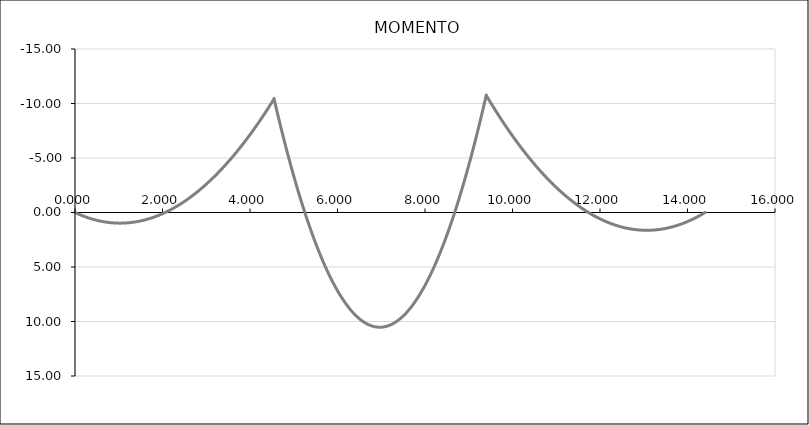
| Category | Series 1 |
|---|---|
| 0.0 | 0 |
| 0.0 | 0 |
| 0.0 | 0 |
| 0.0 | 0 |
| 0.0 | 0 |
| 0.0 | 0 |
| 0.0 | 0 |
| 0.0 | 0 |
| 0.0 | 0 |
| 0.0 | 0 |
| 0.0 | 0 |
| 0.0 | 0 |
| 0.0 | 0 |
| 0.0 | 0 |
| 0.0 | 0 |
| 0.0 | 0 |
| 0.0 | 0 |
| 0.0 | 0 |
| 0.0 | 0 |
| 0.0 | 0 |
| 0.0 | 0 |
| 0.0 | 0 |
| 0.0 | 0 |
| 0.0 | 0 |
| 0.0 | 0 |
| 0.0 | 0 |
| 0.0 | 0 |
| 0.0 | 0 |
| 0.0 | 0 |
| 0.0 | 0 |
| 0.0 | 0 |
| 0.0 | 0 |
| 0.0 | 0 |
| 0.0 | 0 |
| 0.0 | 0 |
| 0.0 | 0 |
| 0.0 | 0 |
| 0.0 | 0 |
| 0.0 | 0 |
| 0.0 | 0 |
| 0.0 | 0 |
| 0.0 | 0 |
| 0.0 | 0 |
| 0.0 | 0 |
| 0.0 | 0 |
| 0.0 | 0 |
| 0.0 | 0 |
| 0.0 | 0 |
| 0.0 | 0 |
| 0.0 | 0 |
| 0.0 | 0 |
| 0.0 | 0 |
| 0.0 | 0 |
| 0.0 | 0 |
| 0.0 | 0 |
| 0.0 | 0 |
| 0.0 | 0 |
| 0.0 | 0 |
| 0.0 | 0 |
| 0.0 | 0 |
| 0.0 | 0 |
| 0.0 | 0 |
| 0.0 | 0 |
| 0.0 | 0 |
| 0.0 | 0 |
| 0.0 | 0 |
| 0.0 | 0 |
| 0.0 | 0 |
| 0.0 | 0 |
| 0.0 | 0 |
| 0.0 | 0 |
| 0.0 | 0 |
| 0.0 | 0 |
| 0.0 | 0 |
| 0.0 | 0 |
| 0.0 | 0 |
| 0.0 | 0 |
| 0.0 | 0 |
| 0.0 | 0 |
| 0.0 | 0 |
| 0.0 | 0 |
| 0.0 | 0 |
| 0.0 | 0 |
| 0.0 | 0 |
| 0.0 | 0 |
| 0.0 | 0 |
| 0.0 | 0 |
| 0.0 | 0 |
| 0.0 | 0 |
| 0.0 | 0 |
| 0.0 | 0 |
| 0.0 | 0 |
| 0.0 | 0 |
| 0.0 | 0 |
| 0.0 | 0 |
| 0.0 | 0 |
| 0.0 | 0 |
| 0.0 | 0 |
| 0.0 | 0 |
| 0.0 | 0 |
| 0.0 | 0 |
| 0.0 | 0 |
| 0.02275 | 0.043 |
| 0.0455 | 0.084 |
| 0.06825 | 0.125 |
| 0.091 | 0.165 |
| 0.11374999999999999 | 0.204 |
| 0.1365 | 0.242 |
| 0.15925 | 0.278 |
| 0.182 | 0.314 |
| 0.20475 | 0.349 |
| 0.22749999999999998 | 0.383 |
| 0.25025 | 0.417 |
| 0.273 | 0.449 |
| 0.29575 | 0.48 |
| 0.3185 | 0.51 |
| 0.34125 | 0.539 |
| 0.364 | 0.568 |
| 0.38675 | 0.595 |
| 0.4095 | 0.622 |
| 0.43224999999999997 | 0.647 |
| 0.45499999999999996 | 0.672 |
| 0.47775 | 0.695 |
| 0.5005 | 0.718 |
| 0.52325 | 0.74 |
| 0.546 | 0.76 |
| 0.56875 | 0.78 |
| 0.5915 | 0.799 |
| 0.61425 | 0.817 |
| 0.637 | 0.834 |
| 0.65975 | 0.85 |
| 0.6825 | 0.865 |
| 0.7052499999999999 | 0.879 |
| 0.728 | 0.892 |
| 0.75075 | 0.904 |
| 0.7735 | 0.915 |
| 0.79625 | 0.925 |
| 0.819 | 0.935 |
| 0.84175 | 0.943 |
| 0.8644999999999999 | 0.951 |
| 0.88725 | 0.957 |
| 0.9099999999999999 | 0.962 |
| 0.93275 | 0.967 |
| 0.9555 | 0.971 |
| 0.97825 | 0.973 |
| 1.001 | 0.975 |
| 1.02375 | 0.976 |
| 1.0465 | 0.975 |
| 1.06925 | 0.974 |
| 1.092 | 0.972 |
| 1.11475 | 0.969 |
| 1.1375 | 0.965 |
| 1.16025 | 0.96 |
| 1.183 | 0.954 |
| 1.2057499999999999 | 0.947 |
| 1.2285 | 0.939 |
| 1.25125 | 0.931 |
| 1.274 | 0.921 |
| 1.29675 | 0.91 |
| 1.3195 | 0.898 |
| 1.34225 | 0.886 |
| 1.365 | 0.872 |
| 1.38775 | 0.858 |
| 1.4104999999999999 | 0.842 |
| 1.43325 | 0.826 |
| 1.456 | 0.809 |
| 1.47875 | 0.79 |
| 1.5015 | 0.771 |
| 1.5242499999999999 | 0.751 |
| 1.547 | 0.73 |
| 1.56975 | 0.707 |
| 1.5925 | 0.684 |
| 1.6152499999999999 | 0.66 |
| 1.638 | 0.635 |
| 1.66075 | 0.609 |
| 1.6835 | 0.582 |
| 1.70625 | 0.555 |
| 1.7289999999999999 | 0.526 |
| 1.75175 | 0.496 |
| 1.7745 | 0.465 |
| 1.79725 | 0.434 |
| 1.8199999999999998 | 0.401 |
| 1.8427499999999999 | 0.368 |
| 1.8655 | 0.333 |
| 1.88825 | 0.298 |
| 1.911 | 0.261 |
| 1.9337499999999999 | 0.224 |
| 1.9565 | 0.186 |
| 1.97925 | 0.146 |
| 2.002 | 0.106 |
| 2.02475 | 0.065 |
| 2.0475 | 0.023 |
| 2.07025 | -0.02 |
| 2.093 | -0.064 |
| 2.11575 | -0.109 |
| 2.1385 | -0.155 |
| 2.16125 | -0.202 |
| 2.184 | -0.25 |
| 2.20675 | -0.299 |
| 2.2295 | -0.349 |
| 2.25225 | -0.399 |
| 2.275 | -0.451 |
| 2.2977499999999997 | -0.503 |
| 2.3205 | -0.557 |
| 2.34325 | -0.612 |
| 2.366 | -0.667 |
| 2.38875 | -0.723 |
| 2.4114999999999998 | -0.781 |
| 2.43425 | -0.839 |
| 2.457 | -0.898 |
| 2.47975 | -0.959 |
| 2.5025 | -1.02 |
| 2.5252499999999998 | -1.082 |
| 2.548 | -1.145 |
| 2.57075 | -1.209 |
| 2.5935 | -1.274 |
| 2.61625 | -1.34 |
| 2.639 | -1.407 |
| 2.66175 | -1.475 |
| 2.6845 | -1.543 |
| 2.7072499999999997 | -1.613 |
| 2.73 | -1.684 |
| 2.75275 | -1.755 |
| 2.7755 | -1.828 |
| 2.79825 | -1.902 |
| 2.8209999999999997 | -1.976 |
| 2.84375 | -2.052 |
| 2.8665 | -2.128 |
| 2.88925 | -2.205 |
| 2.912 | -2.284 |
| 2.9347499999999997 | -2.363 |
| 2.9575 | -2.443 |
| 2.98025 | -2.524 |
| 3.003 | -2.606 |
| 3.02575 | -2.689 |
| 3.0484999999999998 | -2.774 |
| 3.07125 | -2.858 |
| 3.094 | -2.944 |
| 3.11675 | -3.031 |
| 3.1395 | -3.119 |
| 3.16225 | -3.208 |
| 3.185 | -3.298 |
| 3.20775 | -3.388 |
| 3.2304999999999997 | -3.48 |
| 3.25325 | -3.573 |
| 3.276 | -3.666 |
| 3.29875 | -3.761 |
| 3.3215 | -3.856 |
| 3.3442499999999997 | -3.953 |
| 3.367 | -4.05 |
| 3.38975 | -4.148 |
| 3.4125 | -4.247 |
| 3.43525 | -4.348 |
| 3.4579999999999997 | -4.449 |
| 3.48075 | -4.551 |
| 3.5035 | -4.654 |
| 3.52625 | -4.758 |
| 3.549 | -4.863 |
| 3.5717499999999998 | -4.969 |
| 3.5945 | -5.076 |
| 3.61725 | -5.184 |
| 3.6399999999999997 | -5.292 |
| 3.66275 | -5.402 |
| 3.6854999999999998 | -5.513 |
| 3.70825 | -5.625 |
| 3.731 | -5.737 |
| 3.7537499999999997 | -5.851 |
| 3.7765 | -5.965 |
| 3.79925 | -6.081 |
| 3.822 | -6.197 |
| 3.84475 | -6.314 |
| 3.8674999999999997 | -6.433 |
| 3.89025 | -6.552 |
| 3.913 | -6.672 |
| 3.93575 | -6.793 |
| 3.9585 | -6.915 |
| 3.9812499999999997 | -7.039 |
| 4.004 | -7.163 |
| 4.02675 | -7.288 |
| 4.0495 | -7.413 |
| 4.0722499999999995 | -7.54 |
| 4.095 | -7.668 |
| 4.11775 | -7.797 |
| 4.1405 | -7.927 |
| 4.16325 | -8.057 |
| 4.186 | -8.189 |
| 4.20875 | -8.322 |
| 4.2315 | -8.455 |
| 4.25425 | -8.59 |
| 4.277 | -8.725 |
| 4.2997499999999995 | -8.862 |
| 4.3225 | -8.999 |
| 4.34525 | -9.137 |
| 4.368 | -9.276 |
| 4.39075 | -9.417 |
| 4.4135 | -9.558 |
| 4.43625 | -9.7 |
| 4.459 | -9.843 |
| 4.48175 | -9.987 |
| 4.5045 | -10.132 |
| 4.5272499999999996 | -10.278 |
| 4.55 | -10.425 |
| 4.55 | -10.425 |
| 4.57425 | -10.006 |
| 4.5985 | -9.592 |
| 4.62275 | -9.182 |
| 4.647 | -8.776 |
| 4.67125 | -8.375 |
| 4.6955 | -7.977 |
| 4.7197499999999994 | -7.584 |
| 4.744 | -7.195 |
| 4.76825 | -6.81 |
| 4.7924999999999995 | -6.43 |
| 4.81675 | -6.054 |
| 4.841 | -5.681 |
| 4.86525 | -5.314 |
| 4.8895 | -4.95 |
| 4.913749999999999 | -4.591 |
| 4.938 | -4.235 |
| 4.96225 | -3.884 |
| 4.9864999999999995 | -3.538 |
| 5.01075 | -3.195 |
| 5.035 | -2.857 |
| 5.05925 | -2.523 |
| 5.0835 | -2.193 |
| 5.107749999999999 | -1.867 |
| 5.132 | -1.546 |
| 5.15625 | -1.229 |
| 5.180499999999999 | -0.916 |
| 5.20475 | -0.607 |
| 5.229 | -0.303 |
| 5.2532499999999995 | -0.002 |
| 5.2775 | 0.294 |
| 5.30175 | 0.585 |
| 5.326 | 0.873 |
| 5.35025 | 1.156 |
| 5.374499999999999 | 1.436 |
| 5.39875 | 1.711 |
| 5.423 | 1.981 |
| 5.4472499999999995 | 2.248 |
| 5.4715 | 2.51 |
| 5.495749999999999 | 2.768 |
| 5.52 | 3.022 |
| 5.54425 | 3.272 |
| 5.5685 | 3.517 |
| 5.59275 | 3.758 |
| 5.617 | 3.995 |
| 5.641249999999999 | 4.228 |
| 5.6655 | 4.456 |
| 5.68975 | 4.681 |
| 5.7139999999999995 | 4.901 |
| 5.73825 | 5.117 |
| 5.762499999999999 | 5.328 |
| 5.78675 | 5.536 |
| 5.811 | 5.739 |
| 5.835249999999999 | 5.938 |
| 5.8595 | 6.132 |
| 5.883749999999999 | 6.323 |
| 5.9079999999999995 | 6.509 |
| 5.93225 | 6.691 |
| 5.9565 | 6.869 |
| 5.98075 | 7.043 |
| 6.005 | 7.212 |
| 6.029249999999999 | 7.377 |
| 6.0535 | 7.538 |
| 6.07775 | 7.695 |
| 6.101999999999999 | 7.847 |
| 6.12625 | 7.996 |
| 6.150499999999999 | 8.14 |
| 6.1747499999999995 | 8.28 |
| 6.199 | 8.415 |
| 6.22325 | 8.547 |
| 6.2475 | 8.674 |
| 6.27175 | 8.797 |
| 6.295999999999999 | 8.915 |
| 6.32025 | 9.03 |
| 6.3445 | 9.14 |
| 6.3687499999999995 | 9.246 |
| 6.393 | 9.348 |
| 6.417249999999999 | 9.446 |
| 6.4415 | 9.539 |
| 6.46575 | 9.628 |
| 6.489999999999999 | 9.713 |
| 6.51425 | 9.794 |
| 6.538499999999999 | 9.87 |
| 6.562749999999999 | 9.943 |
| 6.587 | 10.011 |
| 6.61125 | 10.075 |
| 6.6354999999999995 | 10.134 |
| 6.659749999999999 | 10.19 |
| 6.683999999999999 | 10.241 |
| 6.70825 | 10.288 |
| 6.7325 | 10.33 |
| 6.756749999999999 | 10.369 |
| 6.781 | 10.403 |
| 6.805249999999999 | 10.433 |
| 6.8294999999999995 | 10.459 |
| 6.85375 | 10.481 |
| 6.878 | 10.498 |
| 6.9022499999999996 | 10.511 |
| 6.926499999999999 | 10.52 |
| 6.950749999999999 | 10.525 |
| 6.975 | 10.525 |
| 6.99925 | 10.522 |
| 7.023499999999999 | 10.514 |
| 7.04775 | 10.502 |
| 7.071999999999999 | 10.485 |
| 7.0962499999999995 | 10.465 |
| 7.1205 | 10.44 |
| 7.14475 | 10.411 |
| 7.169 | 10.377 |
| 7.193249999999999 | 10.34 |
| 7.217499999999999 | 10.298 |
| 7.24175 | 10.252 |
| 7.266 | 10.202 |
| 7.2902499999999995 | 10.148 |
| 7.314499999999999 | 10.089 |
| 7.338749999999999 | 10.026 |
| 7.3629999999999995 | 9.959 |
| 7.38725 | 9.888 |
| 7.411499999999999 | 9.812 |
| 7.43575 | 9.733 |
| 7.459999999999999 | 9.649 |
| 7.484249999999999 | 9.561 |
| 7.5085 | 9.468 |
| 7.53275 | 9.372 |
| 7.5569999999999995 | 9.271 |
| 7.581249999999999 | 9.166 |
| 7.605499999999999 | 9.056 |
| 7.62975 | 8.943 |
| 7.654 | 8.825 |
| 7.678249999999999 | 8.703 |
| 7.7025 | 8.577 |
| 7.726749999999999 | 8.447 |
| 7.7509999999999994 | 8.312 |
| 7.77525 | 8.173 |
| 7.7995 | 8.03 |
| 7.8237499999999995 | 7.883 |
| 7.847999999999999 | 7.731 |
| 7.872249999999999 | 7.576 |
| 7.8965 | 7.416 |
| 7.92075 | 7.251 |
| 7.944999999999999 | 7.083 |
| 7.969249999999999 | 6.91 |
| 7.993499999999999 | 6.734 |
| 8.01775 | 6.553 |
| 8.042 | 6.367 |
| 8.06625 | 6.178 |
| 8.090499999999999 | 5.984 |
| 8.114749999999999 | 5.786 |
| 8.139 | 5.584 |
| 8.16325 | 5.378 |
| 8.1875 | 5.167 |
| 8.211749999999999 | 4.952 |
| 8.235999999999999 | 4.733 |
| 8.26025 | 4.51 |
| 8.2845 | 4.282 |
| 8.30875 | 4.051 |
| 8.332999999999998 | 3.815 |
| 8.357249999999999 | 3.574 |
| 8.381499999999999 | 3.33 |
| 8.40575 | 3.081 |
| 8.43 | 2.829 |
| 8.45425 | 2.572 |
| 8.4785 | 2.31 |
| 8.502749999999999 | 2.045 |
| 8.527 | 1.775 |
| 8.55125 | 1.501 |
| 8.575499999999998 | 1.223 |
| 8.59975 | 0.94 |
| 8.623999999999999 | 0.654 |
| 8.648249999999999 | 0.363 |
| 8.6725 | 0.068 |
| 8.69675 | -0.231 |
| 8.721 | -0.535 |
| 8.745249999999999 | -0.843 |
| 8.769499999999999 | -1.155 |
| 8.79375 | -1.471 |
| 8.818 | -1.791 |
| 8.84225 | -2.116 |
| 8.866499999999998 | -2.445 |
| 8.89075 | -2.778 |
| 8.915 | -3.115 |
| 8.93925 | -3.456 |
| 8.9635 | -3.802 |
| 8.987749999999998 | -4.152 |
| 9.012 | -4.506 |
| 9.036249999999999 | -4.865 |
| 9.0605 | -5.227 |
| 9.08475 | -5.594 |
| 9.108999999999998 | -5.965 |
| 9.13325 | -6.34 |
| 9.157499999999999 | -6.72 |
| 9.18175 | -7.104 |
| 9.206 | -7.492 |
| 9.230249999999998 | -7.884 |
| 9.2545 | -8.28 |
| 9.278749999999999 | -8.681 |
| 9.302999999999999 | -9.086 |
| 9.32725 | -9.495 |
| 9.3515 | -9.908 |
| 9.37575 | -10.326 |
| 9.399999999999999 | -10.747 |
| 9.399999999999999 | -10.747 |
| 9.424999999999999 | -10.579 |
| 9.45 | -10.412 |
| 9.474999999999998 | -10.246 |
| 9.499999999999998 | -10.081 |
| 9.524999999999999 | -9.918 |
| 9.549999999999999 | -9.756 |
| 9.575 | -9.594 |
| 9.599999999999998 | -9.434 |
| 9.624999999999998 | -9.275 |
| 9.649999999999999 | -9.117 |
| 9.674999999999999 | -8.961 |
| 9.7 | -8.805 |
| 9.724999999999998 | -8.651 |
| 9.749999999999998 | -8.498 |
| 9.774999999999999 | -8.346 |
| 9.799999999999999 | -8.195 |
| 9.825 | -8.045 |
| 9.849999999999998 | -7.896 |
| 9.874999999999998 | -7.749 |
| 9.899999999999999 | -7.603 |
| 9.924999999999999 | -7.457 |
| 9.95 | -7.313 |
| 9.974999999999998 | -7.17 |
| 9.999999999999998 | -7.029 |
| 10.024999999999999 | -6.888 |
| 10.049999999999999 | -6.749 |
| 10.075 | -6.611 |
| 10.099999999999998 | -6.473 |
| 10.124999999999998 | -6.337 |
| 10.149999999999999 | -6.203 |
| 10.174999999999999 | -6.069 |
| 10.2 | -5.936 |
| 10.224999999999998 | -5.805 |
| 10.249999999999998 | -5.675 |
| 10.274999999999999 | -5.546 |
| 10.299999999999999 | -5.418 |
| 10.325 | -5.291 |
| 10.349999999999998 | -5.166 |
| 10.374999999999998 | -5.041 |
| 10.399999999999999 | -4.918 |
| 10.424999999999999 | -4.796 |
| 10.45 | -4.675 |
| 10.474999999999998 | -4.555 |
| 10.499999999999998 | -4.436 |
| 10.524999999999999 | -4.318 |
| 10.549999999999999 | -4.202 |
| 10.575 | -4.087 |
| 10.599999999999998 | -3.973 |
| 10.624999999999998 | -3.86 |
| 10.649999999999999 | -3.748 |
| 10.674999999999999 | -3.637 |
| 10.7 | -3.528 |
| 10.724999999999998 | -3.419 |
| 10.749999999999998 | -3.312 |
| 10.774999999999999 | -3.206 |
| 10.799999999999999 | -3.101 |
| 10.825 | -2.997 |
| 10.849999999999998 | -2.895 |
| 10.874999999999998 | -2.793 |
| 10.899999999999999 | -2.693 |
| 10.924999999999999 | -2.594 |
| 10.95 | -2.496 |
| 10.974999999999998 | -2.399 |
| 10.999999999999998 | -2.303 |
| 11.024999999999999 | -2.209 |
| 11.049999999999999 | -2.115 |
| 11.075 | -2.023 |
| 11.099999999999998 | -1.932 |
| 11.124999999999998 | -1.842 |
| 11.149999999999999 | -1.753 |
| 11.174999999999999 | -1.666 |
| 11.2 | -1.579 |
| 11.224999999999998 | -1.494 |
| 11.249999999999998 | -1.409 |
| 11.274999999999999 | -1.326 |
| 11.299999999999999 | -1.244 |
| 11.325 | -1.164 |
| 11.349999999999998 | -1.084 |
| 11.374999999999998 | -1.006 |
| 11.399999999999999 | -0.928 |
| 11.424999999999999 | -0.852 |
| 11.45 | -0.777 |
| 11.474999999999998 | -0.703 |
| 11.499999999999998 | -0.631 |
| 11.524999999999999 | -0.559 |
| 11.549999999999999 | -0.489 |
| 11.575 | -0.419 |
| 11.599999999999998 | -0.351 |
| 11.624999999999998 | -0.284 |
| 11.649999999999999 | -0.218 |
| 11.674999999999999 | -0.154 |
| 11.7 | -0.09 |
| 11.724999999999998 | -0.028 |
| 11.749999999999998 | 0.033 |
| 11.774999999999999 | 0.093 |
| 11.799999999999999 | 0.152 |
| 11.825 | 0.21 |
| 11.849999999999998 | 0.267 |
| 11.874999999999998 | 0.322 |
| 11.899999999999999 | 0.376 |
| 11.924999999999999 | 0.43 |
| 11.95 | 0.482 |
| 11.974999999999998 | 0.532 |
| 11.999999999999998 | 0.582 |
| 12.024999999999999 | 0.631 |
| 12.049999999999999 | 0.678 |
| 12.075 | 0.724 |
| 12.099999999999998 | 0.769 |
| 12.124999999999998 | 0.813 |
| 12.149999999999999 | 0.856 |
| 12.174999999999999 | 0.898 |
| 12.2 | 0.938 |
| 12.224999999999998 | 0.978 |
| 12.249999999999998 | 1.016 |
| 12.274999999999999 | 1.053 |
| 12.299999999999999 | 1.089 |
| 12.325 | 1.124 |
| 12.349999999999998 | 1.157 |
| 12.374999999999998 | 1.19 |
| 12.399999999999999 | 1.221 |
| 12.424999999999999 | 1.251 |
| 12.45 | 1.28 |
| 12.474999999999998 | 1.308 |
| 12.499999999999998 | 1.335 |
| 12.524999999999999 | 1.36 |
| 12.549999999999999 | 1.385 |
| 12.575 | 1.408 |
| 12.599999999999998 | 1.43 |
| 12.624999999999998 | 1.451 |
| 12.649999999999999 | 1.471 |
| 12.674999999999999 | 1.49 |
| 12.7 | 1.507 |
| 12.724999999999998 | 1.524 |
| 12.749999999999998 | 1.539 |
| 12.774999999999999 | 1.553 |
| 12.799999999999999 | 1.566 |
| 12.825 | 1.577 |
| 12.849999999999998 | 1.588 |
| 12.874999999999998 | 1.598 |
| 12.899999999999999 | 1.606 |
| 12.924999999999999 | 1.613 |
| 12.95 | 1.619 |
| 12.974999999999998 | 1.624 |
| 12.999999999999998 | 1.628 |
| 13.024999999999999 | 1.63 |
| 13.049999999999999 | 1.632 |
| 13.075 | 1.632 |
| 13.099999999999998 | 1.631 |
| 13.124999999999998 | 1.629 |
| 13.149999999999999 | 1.626 |
| 13.174999999999999 | 1.621 |
| 13.2 | 1.616 |
| 13.224999999999998 | 1.609 |
| 13.249999999999998 | 1.601 |
| 13.274999999999999 | 1.592 |
| 13.299999999999999 | 1.582 |
| 13.325 | 1.571 |
| 13.349999999999998 | 1.559 |
| 13.374999999999998 | 1.545 |
| 13.399999999999999 | 1.531 |
| 13.424999999999999 | 1.515 |
| 13.45 | 1.498 |
| 13.474999999999998 | 1.48 |
| 13.5 | 1.46 |
| 13.524999999999999 | 1.44 |
| 13.549999999999999 | 1.418 |
| 13.575 | 1.396 |
| 13.599999999999998 | 1.372 |
| 13.625 | 1.347 |
| 13.649999999999999 | 1.32 |
| 13.674999999999999 | 1.293 |
| 13.7 | 1.265 |
| 13.724999999999998 | 1.235 |
| 13.75 | 1.204 |
| 13.774999999999999 | 1.172 |
| 13.799999999999999 | 1.139 |
| 13.825 | 1.105 |
| 13.849999999999998 | 1.07 |
| 13.875 | 1.033 |
| 13.899999999999999 | 0.995 |
| 13.924999999999999 | 0.956 |
| 13.95 | 0.916 |
| 13.974999999999998 | 0.875 |
| 14.0 | 0.833 |
| 14.024999999999999 | 0.79 |
| 14.049999999999999 | 0.745 |
| 14.075 | 0.699 |
| 14.099999999999998 | 0.652 |
| 14.125 | 0.604 |
| 14.149999999999999 | 0.555 |
| 14.174999999999999 | 0.505 |
| 14.2 | 0.453 |
| 14.224999999999998 | 0.401 |
| 14.25 | 0.347 |
| 14.274999999999999 | 0.292 |
| 14.299999999999999 | 0.236 |
| 14.325 | 0.179 |
| 14.349999999999998 | 0.12 |
| 14.375 | 0.061 |
| 14.399999999999999 | 0 |
| 14.399999999999999 | 0 |
| 14.399999999999999 | 0 |
| 14.399999999999999 | 0 |
| 14.399999999999999 | 0 |
| 14.399999999999999 | 0 |
| 14.399999999999999 | 0 |
| 14.399999999999999 | 0 |
| 14.399999999999999 | 0 |
| 14.399999999999999 | 0 |
| 14.399999999999999 | 0 |
| 14.399999999999999 | 0 |
| 14.399999999999999 | 0 |
| 14.399999999999999 | 0 |
| 14.399999999999999 | 0 |
| 14.399999999999999 | 0 |
| 14.399999999999999 | 0 |
| 14.399999999999999 | 0 |
| 14.399999999999999 | 0 |
| 14.399999999999999 | 0 |
| 14.399999999999999 | 0 |
| 14.399999999999999 | 0 |
| 14.399999999999999 | 0 |
| 14.399999999999999 | 0 |
| 14.399999999999999 | 0 |
| 14.399999999999999 | 0 |
| 14.399999999999999 | 0 |
| 14.399999999999999 | 0 |
| 14.399999999999999 | 0 |
| 14.399999999999999 | 0 |
| 14.399999999999999 | 0 |
| 14.399999999999999 | 0 |
| 14.399999999999999 | 0 |
| 14.399999999999999 | 0 |
| 14.399999999999999 | 0 |
| 14.399999999999999 | 0 |
| 14.399999999999999 | 0 |
| 14.399999999999999 | 0 |
| 14.399999999999999 | 0 |
| 14.399999999999999 | 0 |
| 14.399999999999999 | 0 |
| 14.399999999999999 | 0 |
| 14.399999999999999 | 0 |
| 14.399999999999999 | 0 |
| 14.399999999999999 | 0 |
| 14.399999999999999 | 0 |
| 14.399999999999999 | 0 |
| 14.399999999999999 | 0 |
| 14.399999999999999 | 0 |
| 14.399999999999999 | 0 |
| 14.399999999999999 | 0 |
| 14.399999999999999 | 0 |
| 14.399999999999999 | 0 |
| 14.399999999999999 | 0 |
| 14.399999999999999 | 0 |
| 14.399999999999999 | 0 |
| 14.399999999999999 | 0 |
| 14.399999999999999 | 0 |
| 14.399999999999999 | 0 |
| 14.399999999999999 | 0 |
| 14.399999999999999 | 0 |
| 14.399999999999999 | 0 |
| 14.399999999999999 | 0 |
| 14.399999999999999 | 0 |
| 14.399999999999999 | 0 |
| 14.399999999999999 | 0 |
| 14.399999999999999 | 0 |
| 14.399999999999999 | 0 |
| 14.399999999999999 | 0 |
| 14.399999999999999 | 0 |
| 14.399999999999999 | 0 |
| 14.399999999999999 | 0 |
| 14.399999999999999 | 0 |
| 14.399999999999999 | 0 |
| 14.399999999999999 | 0 |
| 14.399999999999999 | 0 |
| 14.399999999999999 | 0 |
| 14.399999999999999 | 0 |
| 14.399999999999999 | 0 |
| 14.399999999999999 | 0 |
| 14.399999999999999 | 0 |
| 14.399999999999999 | 0 |
| 14.399999999999999 | 0 |
| 14.399999999999999 | 0 |
| 14.399999999999999 | 0 |
| 14.399999999999999 | 0 |
| 14.399999999999999 | 0 |
| 14.399999999999999 | 0 |
| 14.399999999999999 | 0 |
| 14.399999999999999 | 0 |
| 14.399999999999999 | 0 |
| 14.399999999999999 | 0 |
| 14.399999999999999 | 0 |
| 14.399999999999999 | 0 |
| 14.399999999999999 | 0 |
| 14.399999999999999 | 0 |
| 14.399999999999999 | 0 |
| 14.399999999999999 | 0 |
| 14.399999999999999 | 0 |
| 14.399999999999999 | 0 |
| 14.399999999999999 | 0 |
| 14.399999999999999 | 0 |